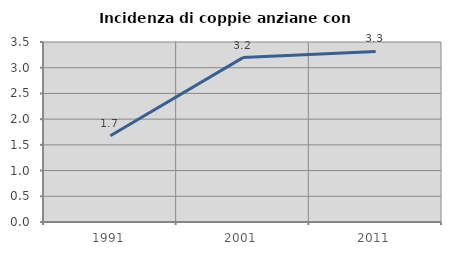
| Category | Incidenza di coppie anziane con figli |
|---|---|
| 1991.0 | 1.676 |
| 2001.0 | 3.196 |
| 2011.0 | 3.316 |